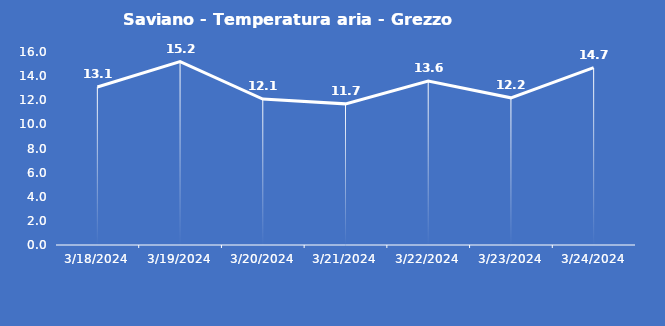
| Category | Saviano - Temperatura aria - Grezzo (°C) |
|---|---|
| 3/18/24 | 13.1 |
| 3/19/24 | 15.2 |
| 3/20/24 | 12.1 |
| 3/21/24 | 11.7 |
| 3/22/24 | 13.6 |
| 3/23/24 | 12.2 |
| 3/24/24 | 14.7 |